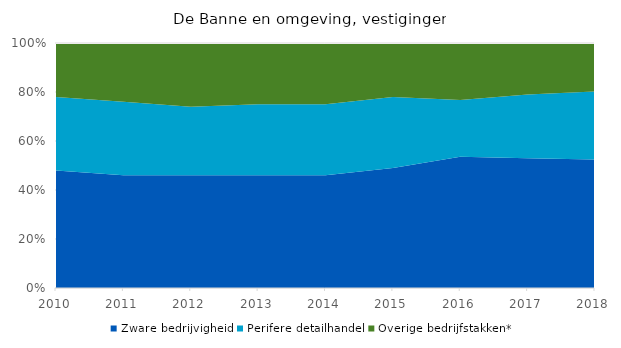
| Category | Zware bedrijvigheid | Perifere detailhandel | Overige bedrijfstakken* |
|---|---|---|---|
| 2010 | 0.48 | 0.3 | 0.22 |
| 2011 | 0.46 | 0.3 | 0.24 |
| 2012 | 0.46 | 0.28 | 0.26 |
| 2013 | 0.46 | 0.29 | 0.25 |
| 2014 | 0.46 | 0.29 | 0.25 |
| 2015 | 0.49 | 0.29 | 0.22 |
| 2016 | 0.53 | 0.23 | 0.23 |
| 2017 | 0.53 | 0.26 | 0.21 |
| 2018 | 0.53 | 0.28 | 0.2 |